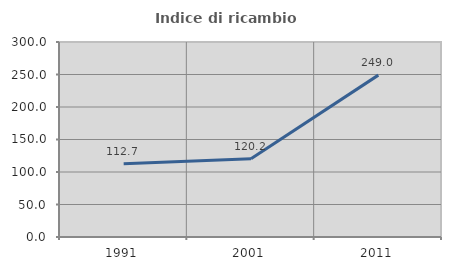
| Category | Indice di ricambio occupazionale  |
|---|---|
| 1991.0 | 112.673 |
| 2001.0 | 120.247 |
| 2011.0 | 249.042 |